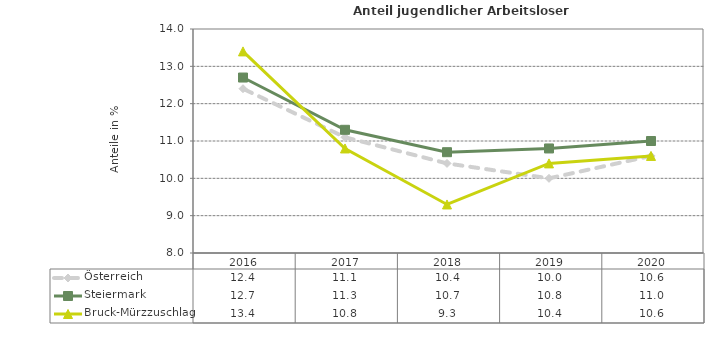
| Category | Österreich | Steiermark | Bruck-Mürzzuschlag |
|---|---|---|---|
| 2020.0 | 10.6 | 11 | 10.6 |
| 2019.0 | 10 | 10.8 | 10.4 |
| 2018.0 | 10.4 | 10.7 | 9.3 |
| 2017.0 | 11.1 | 11.3 | 10.8 |
| 2016.0 | 12.4 | 12.7 | 13.4 |